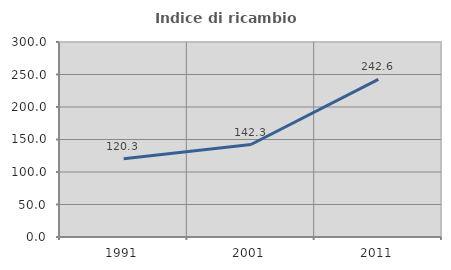
| Category | Indice di ricambio occupazionale  |
|---|---|
| 1991.0 | 120.321 |
| 2001.0 | 142.285 |
| 2011.0 | 242.593 |